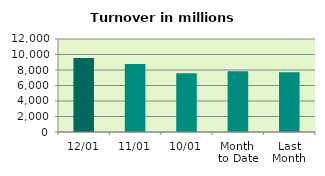
| Category | Series 0 |
|---|---|
| 12/01 | 9546.528 |
| 11/01 | 8761.311 |
| 10/01 | 7587.824 |
| Month 
to Date | 7842.132 |
| Last
Month | 7707.734 |